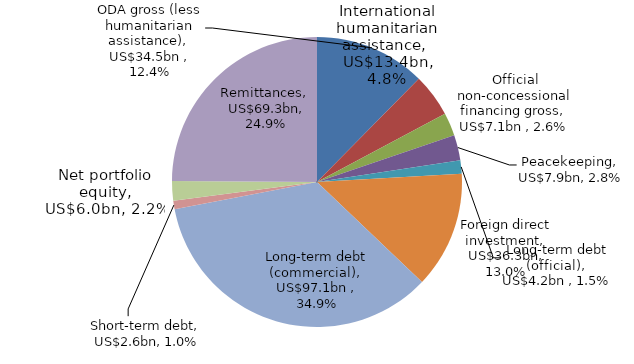
| Category | Series 0 |
|---|---|
| ODA gross (less humanitarian assistance) | 34496.029 |
| International humanitarian assistance | 13400.986 |
| Other official flows gross | 7131.42 |
| Peacekeeping | 7877.825 |
| Long-term debt (official) | 4160.316 |
| Foreign direct investment | 36259.673 |
| Long-term debt (commercial) | 97060.252 |
| Short-term debt | 2646.459 |
| Net portfolio equity | 6032.467 |
| Remittances | 69331.163 |